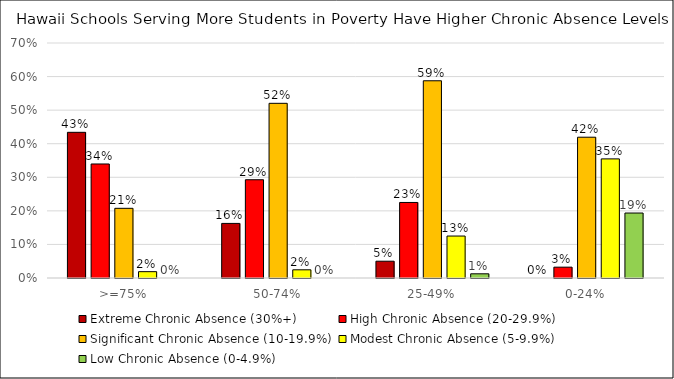
| Category | Extreme Chronic Absence (30%+) | High Chronic Absence (20-29.9%) | Significant Chronic Absence (10-19.9%) | Modest Chronic Absence (5-9.9%) | Low Chronic Absence (0-4.9%) |
|---|---|---|---|---|---|
| >=75% | 0.434 | 0.34 | 0.208 | 0.019 | 0 |
| 50-74% | 0.163 | 0.293 | 0.52 | 0.024 | 0 |
| 25-49% | 0.05 | 0.225 | 0.588 | 0.125 | 0.012 |
| 0-24% | 0 | 0.032 | 0.419 | 0.355 | 0.194 |